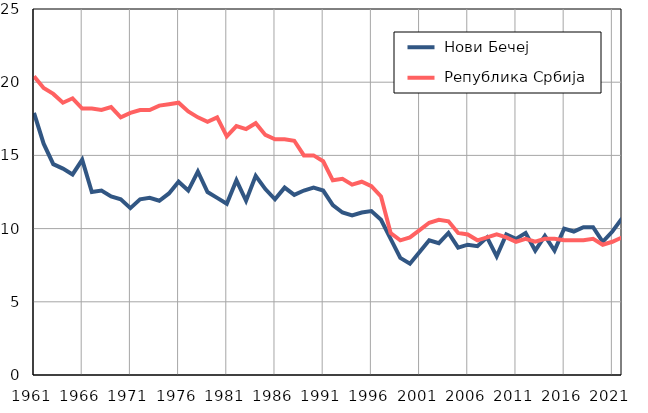
| Category |  Нови Бечеј |  Република Србија |
|---|---|---|
| 1961.0 | 17.9 | 20.4 |
| 1962.0 | 15.8 | 19.6 |
| 1963.0 | 14.4 | 19.2 |
| 1964.0 | 14.1 | 18.6 |
| 1965.0 | 13.7 | 18.9 |
| 1966.0 | 14.7 | 18.2 |
| 1967.0 | 12.5 | 18.2 |
| 1968.0 | 12.6 | 18.1 |
| 1969.0 | 12.2 | 18.3 |
| 1970.0 | 12 | 17.6 |
| 1971.0 | 11.4 | 17.9 |
| 1972.0 | 12 | 18.1 |
| 1973.0 | 12.1 | 18.1 |
| 1974.0 | 11.9 | 18.4 |
| 1975.0 | 12.4 | 18.5 |
| 1976.0 | 13.2 | 18.6 |
| 1977.0 | 12.6 | 18 |
| 1978.0 | 13.9 | 17.6 |
| 1979.0 | 12.5 | 17.3 |
| 1980.0 | 12.1 | 17.6 |
| 1981.0 | 11.7 | 16.3 |
| 1982.0 | 13.3 | 17 |
| 1983.0 | 11.9 | 16.8 |
| 1984.0 | 13.6 | 17.2 |
| 1985.0 | 12.7 | 16.4 |
| 1986.0 | 12 | 16.1 |
| 1987.0 | 12.8 | 16.1 |
| 1988.0 | 12.3 | 16 |
| 1989.0 | 12.6 | 15 |
| 1990.0 | 12.8 | 15 |
| 1991.0 | 12.6 | 14.6 |
| 1992.0 | 11.6 | 13.3 |
| 1993.0 | 11.1 | 13.4 |
| 1994.0 | 10.9 | 13 |
| 1995.0 | 11.1 | 13.2 |
| 1996.0 | 11.2 | 12.9 |
| 1997.0 | 10.6 | 12.2 |
| 1998.0 | 9.3 | 9.7 |
| 1999.0 | 8 | 9.2 |
| 2000.0 | 7.6 | 9.4 |
| 2001.0 | 8.4 | 9.9 |
| 2002.0 | 9.2 | 10.4 |
| 2003.0 | 9 | 10.6 |
| 2004.0 | 9.7 | 10.5 |
| 2005.0 | 8.7 | 9.7 |
| 2006.0 | 8.9 | 9.6 |
| 2007.0 | 8.8 | 9.2 |
| 2008.0 | 9.4 | 9.4 |
| 2009.0 | 8.1 | 9.6 |
| 2010.0 | 9.6 | 9.4 |
| 2011.0 | 9.3 | 9.1 |
| 2012.0 | 9.7 | 9.3 |
| 2013.0 | 8.5 | 9.1 |
| 2014.0 | 9.5 | 9.3 |
| 2015.0 | 8.5 | 9.3 |
| 2016.0 | 10 | 9.2 |
| 2017.0 | 9.8 | 9.2 |
| 2018.0 | 10.1 | 9.2 |
| 2019.0 | 10.1 | 9.3 |
| 2020.0 | 9.1 | 8.9 |
| 2021.0 | 9.8 | 9.1 |
| 2022.0 | 10.7 | 9.4 |